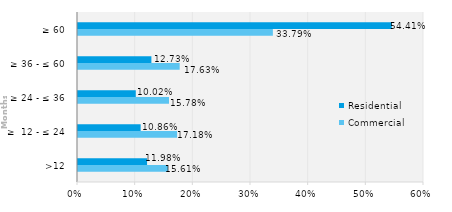
| Category | Commercial | Residential |
|---|---|---|
| >12 | 0.156 | 0.12 |
| ≥  12 - ≤ 24 | 0.172 | 0.109 |
| ≥ 24 - ≤ 36 | 0.158 | 0.1 |
| ≥ 36 - ≤ 60 | 0.176 | 0.127 |
| ≥ 60 | 0.338 | 0.544 |